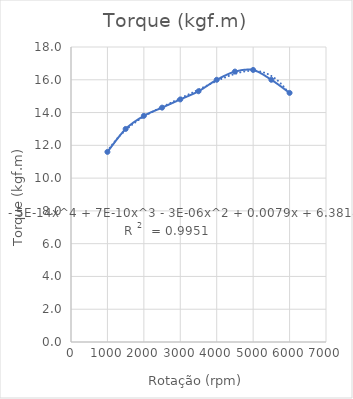
| Category | Torque |
|---|---|
| 1000.0 | 11.6 |
| 1500.0 | 13 |
| 2000.0 | 13.8 |
| 2500.0 | 14.3 |
| 3000.0 | 14.8 |
| 3500.0 | 15.3 |
| 4000.0 | 16 |
| 4500.0 | 16.5 |
| 5000.0 | 16.6 |
| 5500.0 | 16 |
| 6000.0 | 15.2 |